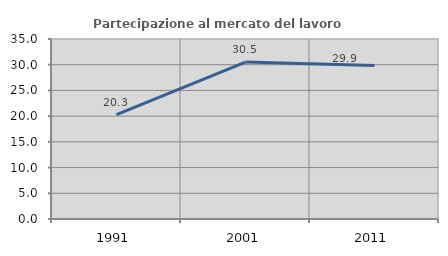
| Category | Partecipazione al mercato del lavoro  femminile |
|---|---|
| 1991.0 | 20.302 |
| 2001.0 | 30.516 |
| 2011.0 | 29.858 |